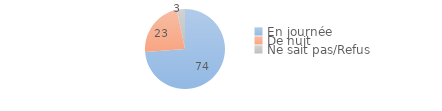
| Category | Series 0 |
|---|---|
| En journée | 73.8 |
| De nuit | 22.938 |
| Ne sait pas/Refus | 3.262 |